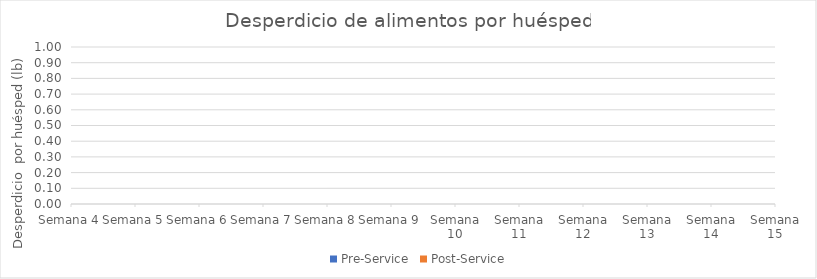
| Category | Pre-Service | Post-Service |
|---|---|---|
| Semana 4 | 0 | 0 |
| Semana 5 | 0 | 0 |
| Semana 6 | 0 | 0 |
| Semana 7 | 0 | 0 |
| Semana 8 | 0 | 0 |
| Semana 9 | 0 | 0 |
| Semana 10 | 0 | 0 |
| Semana 11 | 0 | 0 |
| Semana 12 | 0 | 0 |
| Semana 13 | 0 | 0 |
| Semana 14 | 0 | 0 |
| Semana 15 | 0 | 0 |